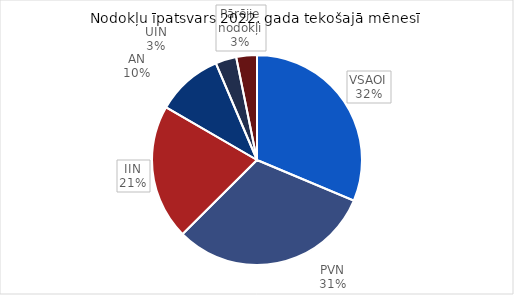
| Category | īpatsvars 2022 |
|---|---|
| VSAOI | 0.313 |
| PVN | 0.312 |
| IIN | 0.208 |
| AN | 0.102 |
| UIN | 0.032 |
| Pārējie nodokļi | 0.032 |